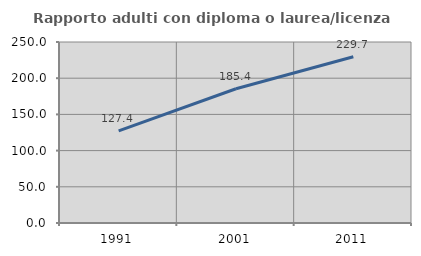
| Category | Rapporto adulti con diploma o laurea/licenza media  |
|---|---|
| 1991.0 | 127.358 |
| 2001.0 | 185.408 |
| 2011.0 | 229.694 |